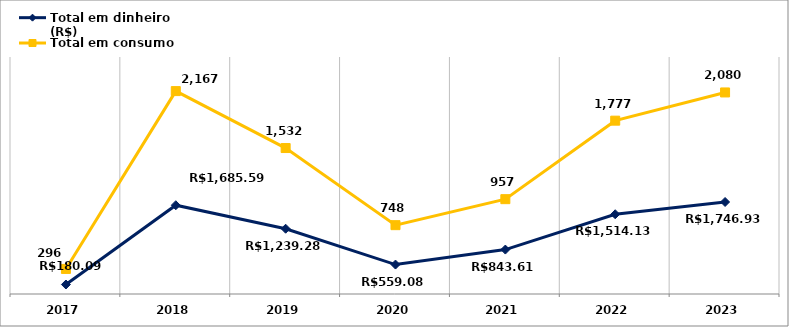
| Category | Total em dinheiro (R$) | Total em consumo (kWh) |
|---|---|---|
| 2017.0 | 180.09 | 296 |
| 2018.0 | 1685.59 | 2167 |
| 2019.0 | 1239.28 | 1532 |
| 2020.0 | 559.08 | 748 |
| 2021.0 | 843.61 | 957 |
| 2022.0 | 1514.13 | 1777 |
| 2023.0 | 1746.93 | 2080 |